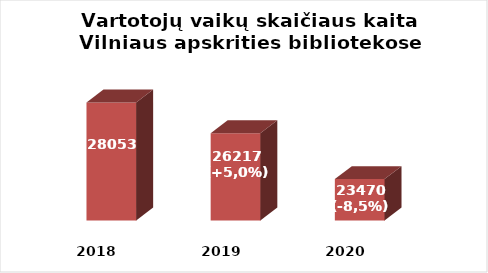
| Category | Series 0 |
|---|---|
| 2018.0 | 28053 |
| 2019.0 | 26217 |
| 2020.0 | 23470 |